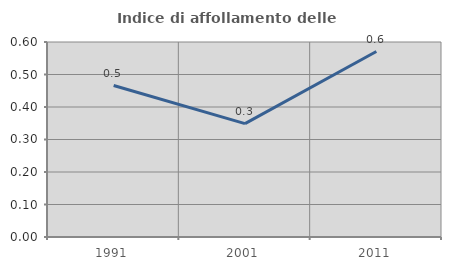
| Category | Indice di affollamento delle abitazioni  |
|---|---|
| 1991.0 | 0.466 |
| 2001.0 | 0.349 |
| 2011.0 | 0.571 |